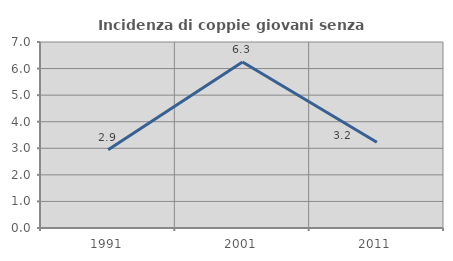
| Category | Incidenza di coppie giovani senza figli |
|---|---|
| 1991.0 | 2.941 |
| 2001.0 | 6.25 |
| 2011.0 | 3.226 |